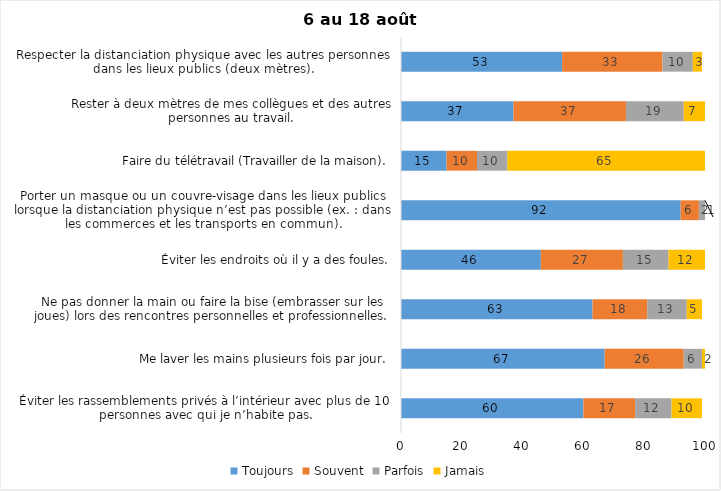
| Category | Toujours | Souvent | Parfois | Jamais |
|---|---|---|---|---|
| Éviter les rassemblements privés à l’intérieur avec plus de 10 personnes avec qui je n’habite pas. | 60 | 17 | 12 | 10 |
| Me laver les mains plusieurs fois par jour. | 67 | 26 | 6 | 2 |
| Ne pas donner la main ou faire la bise (embrasser sur les joues) lors des rencontres personnelles et professionnelles. | 63 | 18 | 13 | 5 |
| Éviter les endroits où il y a des foules. | 46 | 27 | 15 | 12 |
| Porter un masque ou un couvre-visage dans les lieux publics lorsque la distanciation physique n’est pas possible (ex. : dans les commerces et les transports en commun). | 92 | 6 | 2 | 1 |
| Faire du télétravail (Travailler de la maison). | 15 | 10 | 10 | 65 |
| Rester à deux mètres de mes collègues et des autres personnes au travail. | 37 | 37 | 19 | 7 |
| Respecter la distanciation physique avec les autres personnes dans les lieux publics (deux mètres). | 53 | 33 | 10 | 3 |